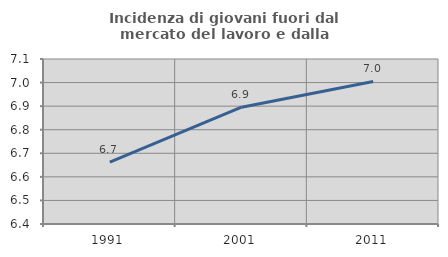
| Category | Incidenza di giovani fuori dal mercato del lavoro e dalla formazione  |
|---|---|
| 1991.0 | 6.662 |
| 2001.0 | 6.895 |
| 2011.0 | 7.005 |